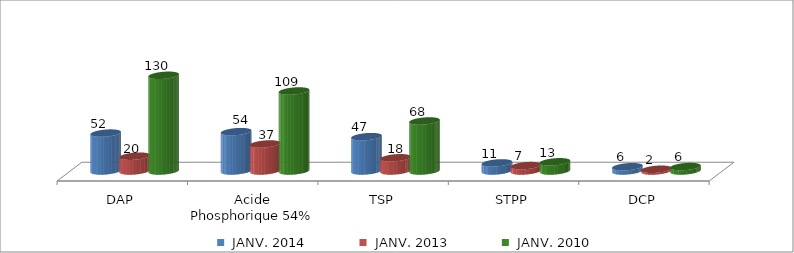
| Category |  JANV. 2014 |  JANV. 2013 |  JANV. 2010 |
|---|---|---|---|
| DAP | 51.58 | 20.17 | 130.2 |
| Acide Phosphorique 54% | 53.551 | 36.778 | 108.861 |
| TSP | 46.742 | 17.995 | 68.049 |
| STPP | 11.025 | 7.345 | 12.52 |
| DCP | 5.81 | 2.4 | 6.04 |